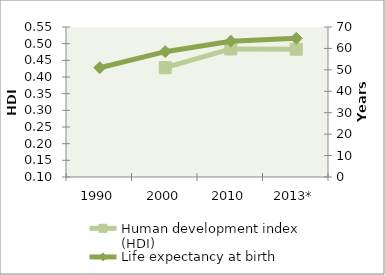
| Category | Human development index (HDI) |
|---|---|
| 1990 | 0 |
| 2000 | 0.428 |
| 2010 | 0.484 |
| 2013* | 0.483 |